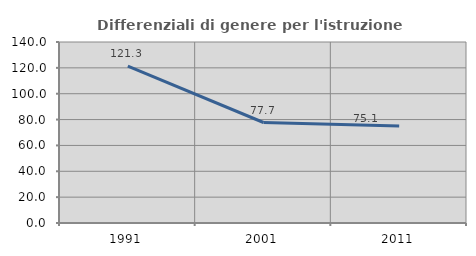
| Category | Differenziali di genere per l'istruzione superiore |
|---|---|
| 1991.0 | 121.348 |
| 2001.0 | 77.728 |
| 2011.0 | 75.095 |